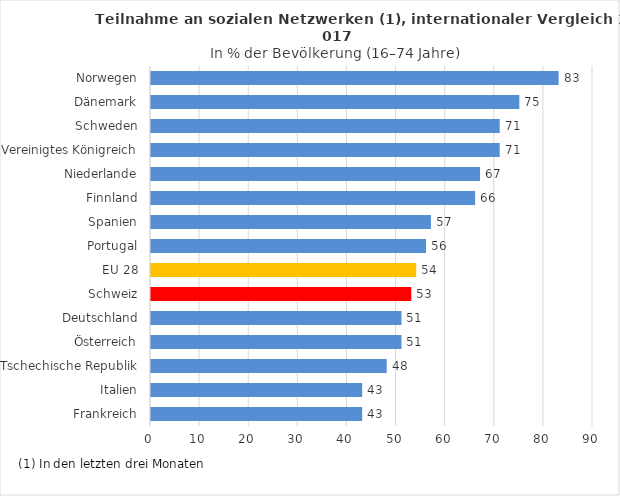
| Category | Series 0 |
|---|---|
| Frankreich | 43 |
| Italien | 43 |
| Tschechische Republik | 48 |
| Österreich | 51 |
| Deutschland | 51 |
| Schweiz | 53 |
| EU 28 | 54 |
| Portugal | 56 |
| Spanien | 57 |
| Finnland | 66 |
| Niederlande | 67 |
| Vereinigtes Königreich | 71 |
| Schweden | 71 |
| Dänemark | 75 |
| Norwegen | 83 |